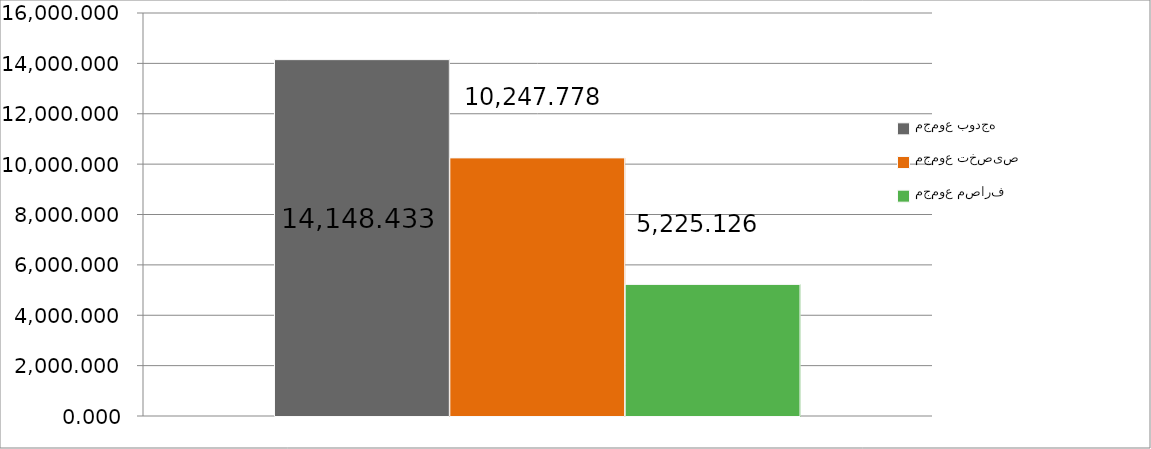
| Category | مجموع بودجه  | مجموع تخصیص | مجموع مصارف |
|---|---|---|---|
| 0 | 14148.433 | 10247.778 | 5225.126 |